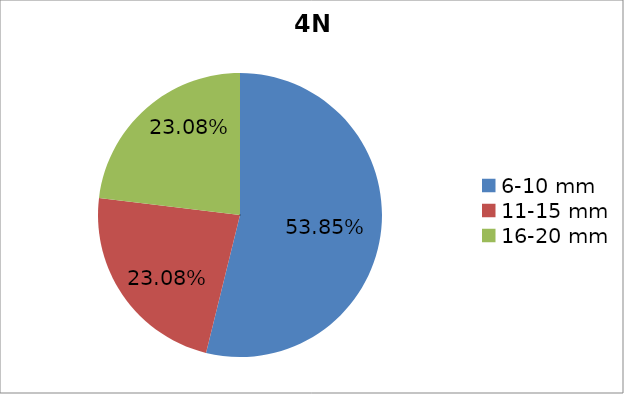
| Category | Series 0 |
|---|---|
| 6-10 mm | 0.538 |
| 11-15 mm | 0.231 |
| 16-20 mm | 0.231 |